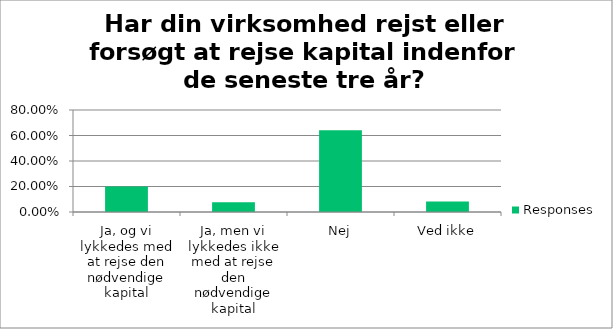
| Category | Responses |
|---|---|
| Ja, og vi lykkedes med at rejse den nødvendige kapital | 0.2 |
| Ja, men vi lykkedes ikke med at rejse den nødvendige kapital | 0.077 |
| Nej | 0.641 |
| Ved ikke | 0.082 |